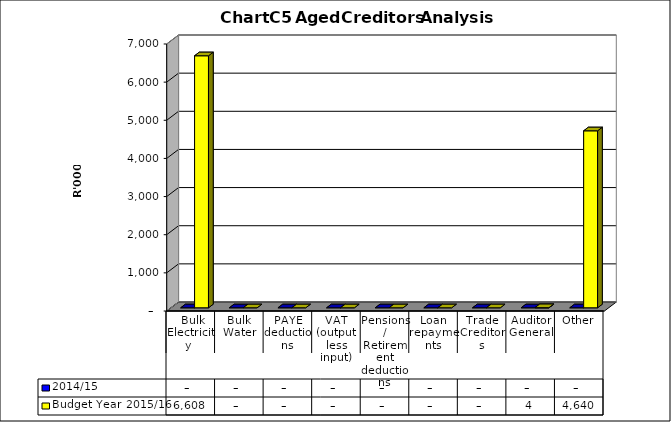
| Category | 2014/15 | Budget Year 2015/16 |
|---|---|---|
|  Bulk Electricity  | 0 | 6607513 |
| Bulk Water | 0 | 0 |
| PAYE deductions | 0 | 0 |
| VAT (output less input) | 0 | 0 |
| Pensions / Retirement deductions | 0 | 0 |
| Loan repayments | 0 | 0 |
| Trade Creditors | 0 | 0 |
| Auditor General | 0 | 4025 |
| Other | 0 | 4640128 |